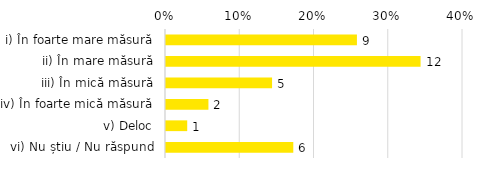
| Category | Total |
|---|---|
| i) În foarte mare măsură | 0.257 |
| ii) În mare măsură | 0.343 |
| iii) În mică măsură | 0.143 |
| iv) În foarte mică măsură | 0.057 |
| v) Deloc | 0.029 |
| vi) Nu știu / Nu răspund | 0.171 |